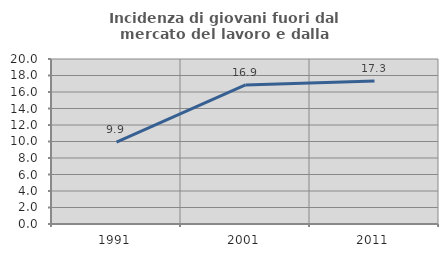
| Category | Incidenza di giovani fuori dal mercato del lavoro e dalla formazione  |
|---|---|
| 1991.0 | 9.926 |
| 2001.0 | 16.86 |
| 2011.0 | 17.333 |